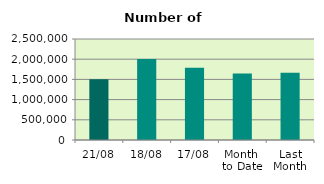
| Category | Series 0 |
|---|---|
| 21/08 | 1506138 |
| 18/08 | 2003428 |
| 17/08 | 1790680 |
| Month 
to Date | 1647168.667 |
| Last
Month | 1667155.619 |